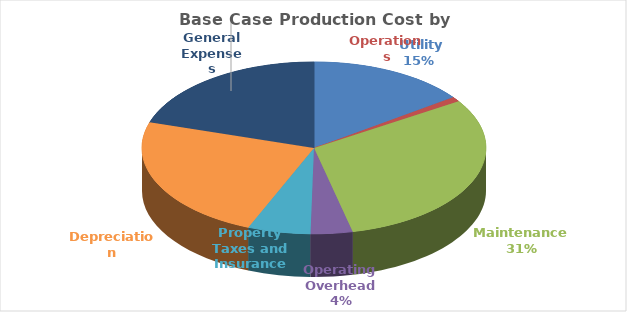
| Category | Series 0 |
|---|---|
|  Utility  | 6.261 |
| Operations | 0.371 |
| Maintenance  | 12.747 |
| Operating Overhead  | 1.638 |
| Property Taxes and Insurance | 2.463 |
| Depreciation | 9.853 |
| General Expenses | 8.431 |